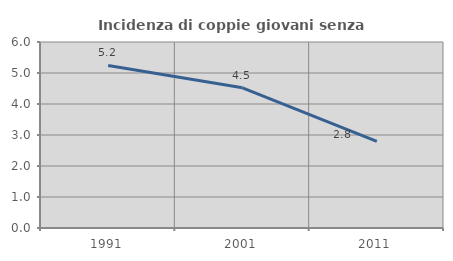
| Category | Incidenza di coppie giovani senza figli |
|---|---|
| 1991.0 | 5.245 |
| 2001.0 | 4.522 |
| 2011.0 | 2.797 |